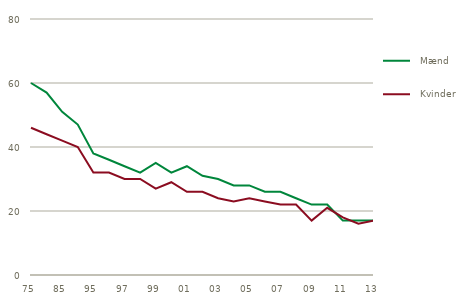
| Category |   Mænd |   Kvinder |
|---|---|---|
| 75 | 60 | 46 |
| 80 | 57 | 44 |
| 85 | 51 | 42 |
| 90 | 47 | 40 |
| 95 | 38 | 32 |
| 96 | 36 | 32 |
| 97 | 34 | 30 |
| 98 | 32 | 30 |
| 99 | 35 | 27 |
| 00 | 32 | 29 |
| 01 | 34 | 26 |
| 02 | 31 | 26 |
| 03 | 30 | 24 |
| 04 | 28 | 23 |
| 05 | 28 | 24 |
| 06 | 26 | 23 |
| 07 | 26 | 22 |
| 08 | 24 | 22 |
| 09 | 22 | 17 |
| 10 | 22 | 21 |
| 11 | 17 | 18 |
| 12 | 17 | 16 |
| 13 | 17 | 17 |